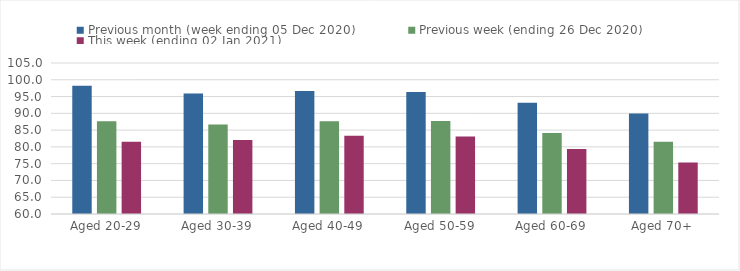
| Category | Previous month (week ending 05 Dec 2020) | Previous week (ending 26 Dec 2020) | This week (ending 02 Jan 2021) |
|---|---|---|---|
| Aged 20-29 | 98.21 | 87.64 | 81.54 |
| Aged 30-39 | 95.9 | 86.64 | 82.07 |
| Aged 40-49 | 96.66 | 87.62 | 83.29 |
| Aged 50-59 | 96.33 | 87.71 | 83.13 |
| Aged 60-69 | 93.15 | 84.11 | 79.37 |
| Aged 70+ | 89.96 | 81.54 | 75.38 |